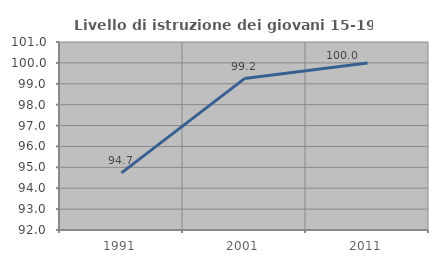
| Category | Livello di istruzione dei giovani 15-19 anni |
|---|---|
| 1991.0 | 94.737 |
| 2001.0 | 99.248 |
| 2011.0 | 100 |